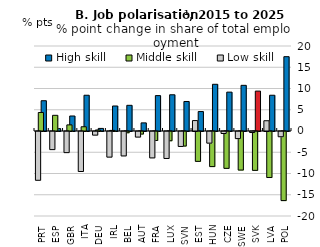
| Category | High skill | Middle skill | Low skill |
|---|---|---|---|
| POL | 17.488 | -16.257 | -1.231 |
| LVA | 8.414 | -10.827 | 2.414 |
| SVK | 9.387 | -9.146 | -0.241 |
| SWE | 10.745 | -9.073 | -1.672 |
| CZE | 9.144 | -8.672 | -0.471 |
| HUN | 10.992 | -8.256 | -2.736 |
| EST | 4.575 | -7.028 | 2.453 |
| SVN | 6.943 | -3.424 | -3.519 |
| LUX | 8.523 | -2.177 | -6.346 |
| FRA | 8.329 | -2.116 | -6.213 |
| AUT | 1.912 | -0.598 | -1.314 |
| BEL | 6.043 | -0.294 | -5.748 |
| IRL | 5.884 | 0.142 | -6.026 |
| DEU | 0.608 | 0.243 | -0.851 |
| ITA | 8.415 | 0.999 | -9.414 |
| GBR | 3.53 | 1.438 | -4.967 |
| ESP | 0.57 | 3.691 | -4.261 |
| PRT | 7.124 | 4.355 | -11.479 |